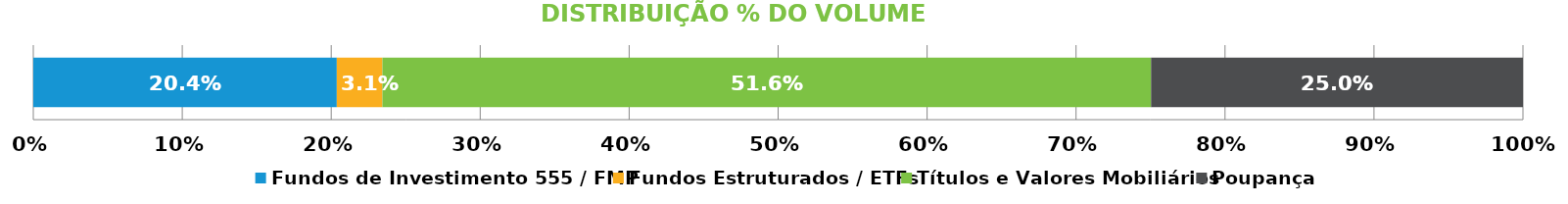
| Category | Fundos de Investimento 555 / FMP | Fundos Estruturados / ETFs | Títulos e Valores Mobiliários | Poupança |
|---|---|---|---|---|
| 0 | 0.204 | 0.031 | 0.516 | 0.25 |